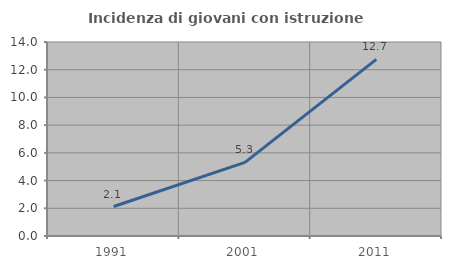
| Category | Incidenza di giovani con istruzione universitaria |
|---|---|
| 1991.0 | 2.128 |
| 2001.0 | 5.31 |
| 2011.0 | 12.745 |